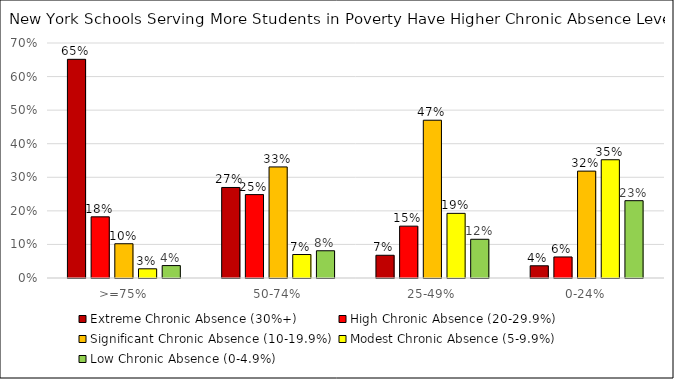
| Category | Extreme Chronic Absence (30%+) | High Chronic Absence (20-29.9%) | Significant Chronic Absence (10-19.9%) | Modest Chronic Absence (5-9.9%) | Low Chronic Absence (0-4.9%) |
|---|---|---|---|---|---|
| >=75% | 0.651 | 0.182 | 0.102 | 0.027 | 0.037 |
| 50-74% | 0.27 | 0.248 | 0.331 | 0.07 | 0.081 |
| 25-49% | 0.068 | 0.154 | 0.47 | 0.193 | 0.115 |
| 0-24% | 0.036 | 0.063 | 0.318 | 0.352 | 0.23 |